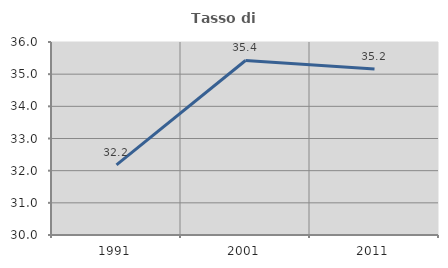
| Category | Tasso di occupazione   |
|---|---|
| 1991.0 | 32.178 |
| 2001.0 | 35.425 |
| 2011.0 | 35.157 |